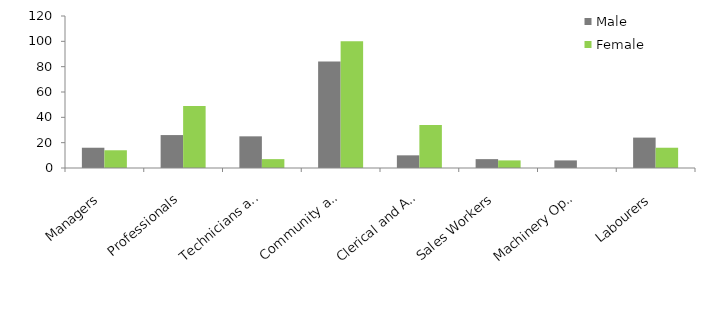
| Category | Male | Female |
|---|---|---|
| Managers | 16 | 14 |
| Professionals | 26 | 49 |
| Technicians and Trades Workers | 25 | 7 |
| Community and Personal Service Workers | 84 | 100 |
| Clerical and Administrative Workers | 10 | 34 |
| Sales Workers | 7 | 6 |
| Machinery Operators and Drivers | 6 | 0 |
| Labourers | 24 | 16 |